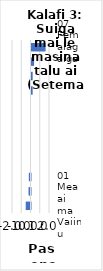
| Category | All items - m-m changes |
|---|---|
| 07 Femalagaiga | 1.524 |
| 05 Meafale, Mea Faigaleuga mo Faaleleia o Aiga | 0.279 |
| 04 Fale, Suavai, Eletise, Kesi ma isi | 0.127 |
| 02 Ava Malosi ma Tapaa | 0.126 |
| 06 Soifua Maloloina | 0 |
| 11 Faleaiga | 0 |
| 08 Fesootaiga | 0 |
| 10 Aoaoga | 0 |
| 09 Faafiafiaga ma Aganuu | 0 |
| 12 Isi Oloa ma Auaunaga | -0.179 |
| 03 Lavalava ma Seevae | -0.211 |
| 01 Meaai ma Vaiinu | -0.516 |